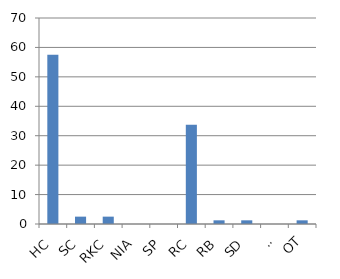
| Category | Series 0 |
|---|---|
| HC | 57.5 |
| SC | 2.5 |
| RKC | 2.5 |
| NIA | 0 |
| SP | 0 |
| RC | 33.75 |
| RB | 1.25 |
| SD | 1.25 |
| SI | 0 |
| OT | 1.25 |